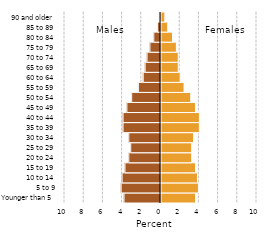
| Category | Female |
|---|---|
| Younger than 5 | 3.6 |
| 5 to 9 | 3.9 |
| 10 to 14 | 3.8 |
| 15 to 19 | 3.6 |
| 20 to 24 | 3.2 |
| 25 to 29 | 3.2 |
| 30 to 34 | 3.4 |
| 35 to 39 | 4 |
| 40 to 44 | 4 |
| 45 to 49 | 3.6 |
| 50 to 54 | 3.1 |
| 55 to 59 | 2.4 |
| 60 to 64 | 2 |
| 65 to 69 | 1.8 |
| 70 to 74 | 1.8 |
| 75 to 79 | 1.6 |
| 80 to 84 | 1.2 |
| 85 to 89 | 0.7 |
| 90 and older | 0.4 |